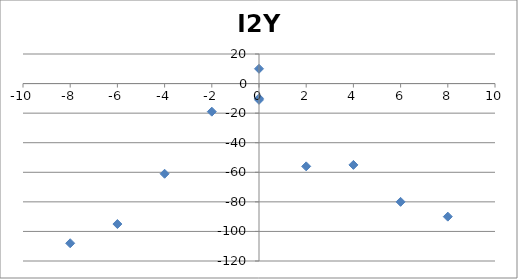
| Category | I2Y |
|---|---|
| 0.0 | 10 |
| 2.0 | -56 |
| 4.0 | -55 |
| 6.0 | -80 |
| 8.0 | -90 |
| 0.0 | -11 |
| -2.0 | -19 |
| -4.0 | -61 |
| -6.0 | -95 |
| -8.0 | -108 |
| 0.0 | -10 |